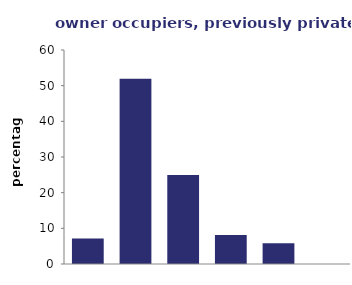
| Category | owner occupiers, previous private renters |
|---|---|
| 16-24 | 7.144 |
| 25-34 | 51.922 |
| 35-44 | 24.97 |
| 45-54 | 8.097 |
| 55-64 | 5.802 |
| 65 or over | 0 |